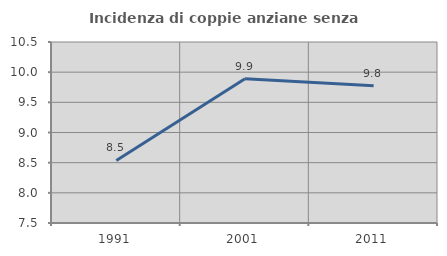
| Category | Incidenza di coppie anziane senza figli  |
|---|---|
| 1991.0 | 8.538 |
| 2001.0 | 9.889 |
| 2011.0 | 9.774 |